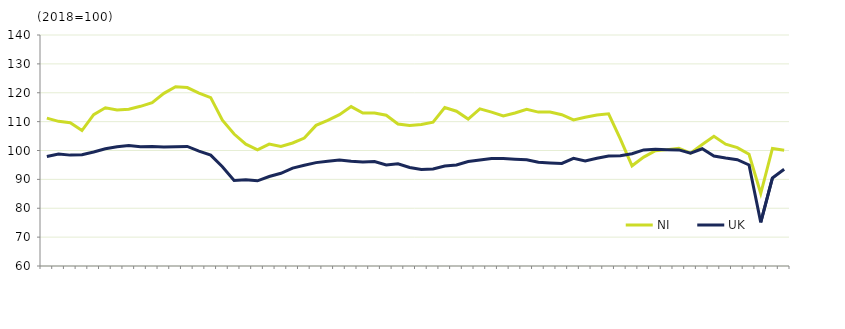
| Category | NI | UK  |
|---|---|---|
|  | 111.2 | 97.9 |
| Q2 2005 | 110.1 | 98.8 |
|  | 109.6 | 98.4 |
| Q4 2005 | 106.9 | 98.5 |
|  | 112.4 | 99.5 |
| Q2 2006 | 114.8 | 100.6 |
|  | 114 | 101.3 |
| Q4 2006 | 114.3 | 101.7 |
|  | 115.3 | 101.3 |
| Q2 2007 | 116.6 | 101.4 |
|  | 119.8 | 101.2 |
| Q4 2007 | 122.1 | 101.3 |
|  | 121.8 | 101.4 |
| Q2 2008 | 119.9 | 99.8 |
|  | 118.3 | 98.4 |
| Q4 2008 | 110.5 | 94.4 |
|  | 105.7 | 89.6 |
| Q2 2009 | 102.2 | 89.9 |
|  | 100.2 | 89.5 |
| Q4 2009 | 102.2 | 91 |
|  | 101.4 | 92.1 |
| Q2 2010 | 102.6 | 93.9 |
|  | 104.3 | 94.9 |
| Q4 2010 | 108.7 | 95.8 |
|  | 110.4 | 96.3 |
| Q2 2011 | 112.4 | 96.7 |
|  | 115.2 | 96.3 |
| Q4 2011 | 113 | 96 |
|  | 113 | 96.2 |
| Q2 2012 | 112.2 | 95 |
|  | 109.2 | 95.4 |
| Q4 2012 | 108.7 | 94.1 |
|  | 109 | 93.4 |
| Q2 2013 | 109.8 | 93.6 |
|  | 114.9 | 94.6 |
| Q4 2013 | 113.6 | 95 |
|  | 110.9 | 96.2 |
| Q2 2014 | 114.4 | 96.7 |
|  | 113.3 | 97.2 |
| Q4 2014 | 112 | 97.2 |
|  | 113 | 97 |
| Q2 2015 | 114.3 | 96.8 |
|  | 113.3 | 95.9 |
| Q4 2015 | 113.3 | 95.7 |
|  | 112.4 | 95.5 |
| Q2 2016 | 110.6 | 97.3 |
|  | 111.5 | 96.4 |
| Q4 2016 | 112.3 | 97.3 |
|  | 112.7 | 98.1 |
| Q2 2017 | 104 | 98.2 |
|  | 94.7 | 98.9 |
| Q4 2017 | 97.7 | 100.2 |
|  | 99.9 | 100.4 |
| Q2 2018 | 100.3 | 100.3 |
|  | 100.8 | 100.2 |
| Q4 2018 | 99.1 | 99.1 |
|  | 102.1 | 100.6 |
| Q2 2019 | 104.9 | 98.1 |
|  | 102.2 | 97.4 |
| Q4 2019 | 101 | 96.8 |
|  | 98.7 | 95 |
| Q2 2020 | 85.1 | 75.1 |
|  | 100.7 | 90.5 |
| Q4 2020 | 100.1 | 93.5 |